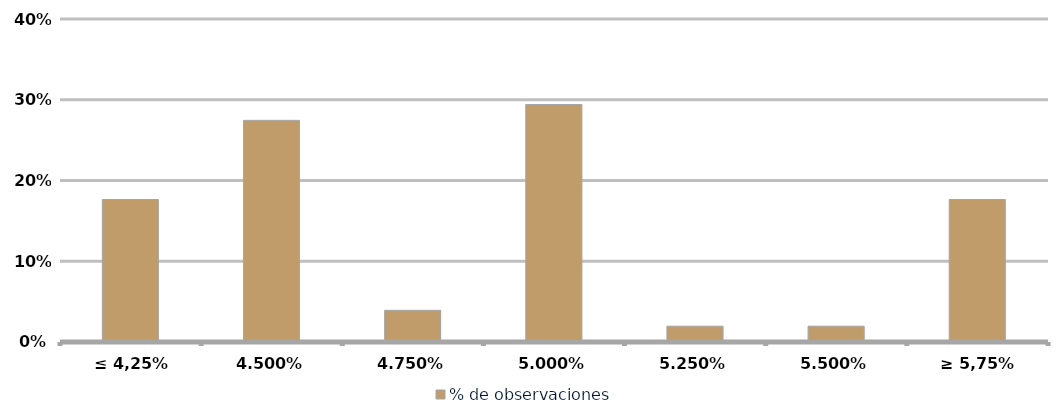
| Category | % de observaciones  |
|---|---|
| ≤ 4,25% | 0.176 |
| 4,50% | 0.275 |
| 4,75% | 0.039 |
| 5,00% | 0.294 |
| 5,25% | 0.02 |
| 5,50% | 0.02 |
| ≥ 5,75% | 0.176 |